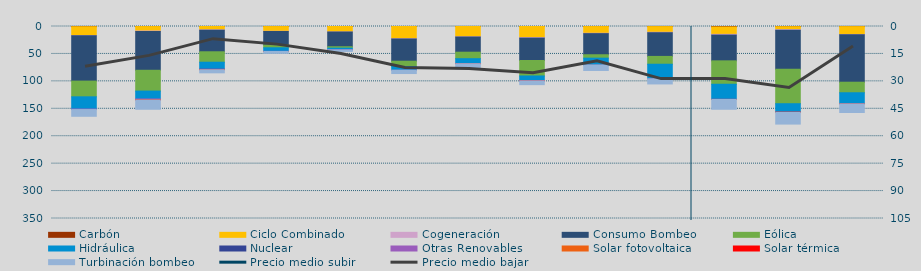
| Category | Carbón | Ciclo Combinado | Cogeneración | Consumo Bombeo | Eólica | Hidráulica | Nuclear | Otras Renovables | Solar fotovoltaica | Solar térmica | Turbinación bombeo |
|---|---|---|---|---|---|---|---|---|---|---|---|
| M | 386.4 | 15979.9 | 321.7 | 82837 | 28654.5 | 22332.5 | 0 | 917.9 | 0 | 0 | 12258.3 |
| A | 97.2 | 8073.6 | 752.2 | 70876 | 37936.3 | 14340.4 | 0 | 1671.6 | 79.6 | 6.4 | 17035.3 |
| M | 18.3 | 6034.6 | 724.9 | 39295.9 | 19044.2 | 12773.5 | 8 | 691.1 | 39.5 | 82.2 | 5747.6 |
| J | 76.6 | 8592.1 | 398.7 | 24576 | 5144.6 | 6431.8 | 0 | 324 | 34.6 | 38.7 | 3246.7 |
| J | 1 | 9886.9 | 142.6 | 26857.1 | 2569.3 | 2887.6 | 128.7 | 129.9 | 0 | 0 | 2875.8 |
| A | 0.8 | 22172.7 | 585.5 | 40530.6 | 9585.7 | 6785.6 | 0 | 88.9 | 0 | 0 | 6008 |
| S | 48.5 | 18683.2 | 429.6 | 27697.3 | 11818.5 | 8778.9 | 227.5 | 47.7 | 0 | 6.7 | 9356.6 |
| O | 25.6 | 20171.4 | 982.8 | 40815.4 | 28187.3 | 8723.5 | 0 | 22.2 | 0 | 12.6 | 7047.9 |
| N | 99.7 | 12211.6 | 730.7 | 38443.4 | 6217.2 | 12240.5 | 30 | 0 | 0 | 0 | 10182.5 |
| D | 167.6 | 10317.2 | 854.6 | 43195 | 14262.7 | 26583.8 | 0 | 16.9 | 0 | 0 | 9305 |
| E | 832.3 | 13484.6 | 1323.9 | 46979.1 | 42652.2 | 27436.3 | 0 | 295.9 | 0.1 | 23.4 | 17846.5 |
| F | 290.9 | 5414.7 | 1039.3 | 71354.3 | 62656.2 | 15580.6 | 0.4 | 126.6 | 22.2 | 105.4 | 21298.3 |
| M | 194.4 | 14321.4 | 355 | 86677.9 | 19233.2 | 20084.3 | 0 | 0 | 0 | 61.3 | 15895.8 |